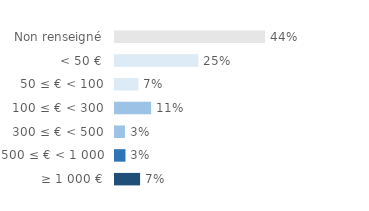
| Category | Series 0 |
|---|---|
| Non renseigné | 0.441 |
| < 50 € | 0.245 |
| 50 ≤ € < 100 | 0.069 |
| 100 ≤ € < 300 | 0.106 |
| 300 ≤ € < 500 | 0.029 |
| 500 ≤ € < 1 000 | 0.031 |
| ≥ 1 000 € | 0.074 |